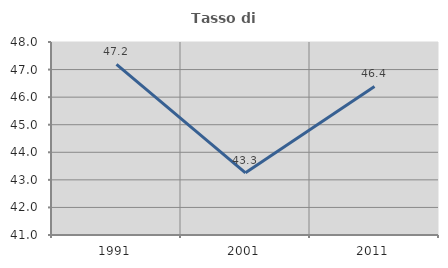
| Category | Tasso di occupazione   |
|---|---|
| 1991.0 | 47.191 |
| 2001.0 | 43.257 |
| 2011.0 | 46.388 |